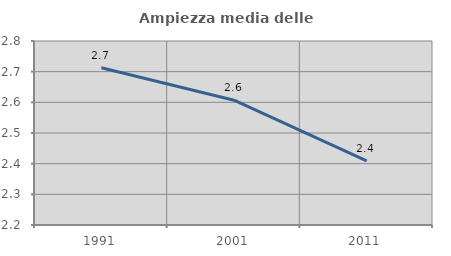
| Category | Ampiezza media delle famiglie |
|---|---|
| 1991.0 | 2.713 |
| 2001.0 | 2.607 |
| 2011.0 | 2.409 |